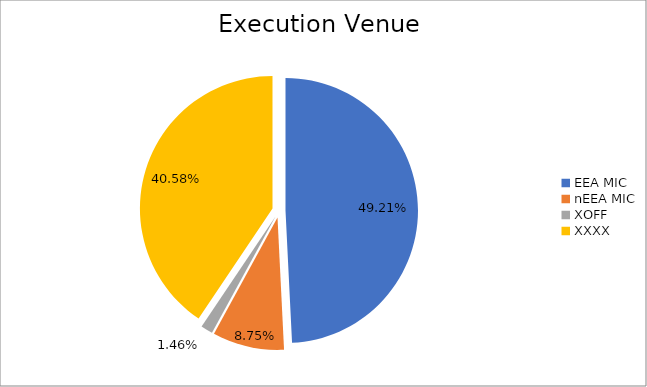
| Category | Series 0 |
|---|---|
| EEA MIC | 6621018.898 |
| nEEA MIC | 1176711.146 |
| XOFF | 196401.003 |
| XXXX | 5460018.415 |